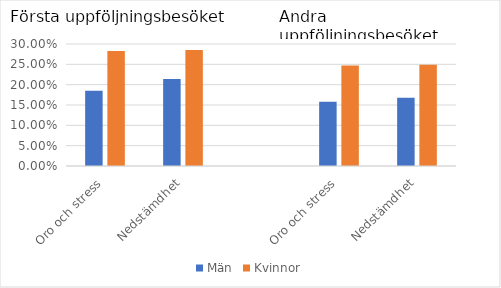
| Category | Män | Kvinnor |
|---|---|---|
| Oro och stress | 0.185 | 0.283 |
| Nedstämdhet | 0.214 | 0.285 |
|  | 0 | 0 |
| Oro och stress | 0.158 | 0.247 |
| Nedstämdhet | 0.168 | 0.249 |